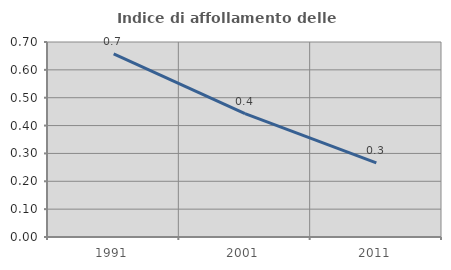
| Category | Indice di affollamento delle abitazioni  |
|---|---|
| 1991.0 | 0.657 |
| 2001.0 | 0.443 |
| 2011.0 | 0.266 |